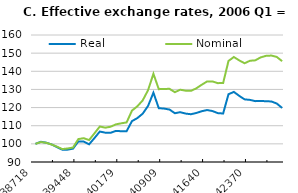
| Category | Real | Nominal |
|---|---|---|
| 38777.0 | 100 | 100 |
| 38869.0 | 101.134 | 101.006 |
| 38961.0 | 100.652 | 100.587 |
| 39052.0 | 99.677 | 99.624 |
| 39142.0 | 98.193 | 98.476 |
| 39234.0 | 96.787 | 97.125 |
| 39326.0 | 96.808 | 97.449 |
| 39417.0 | 97.36 | 97.973 |
| 39508.0 | 101.335 | 102.633 |
| 39600.0 | 101.259 | 103.119 |
| 39692.0 | 99.75 | 102.098 |
| 39783.0 | 103.182 | 105.798 |
| 39873.0 | 106.787 | 109.562 |
| 39965.0 | 106.172 | 108.926 |
| 40057.0 | 106.082 | 109.422 |
| 40148.0 | 107.148 | 110.754 |
| 40238.0 | 106.96 | 111.314 |
| 40330.0 | 107 | 111.818 |
| 40422.0 | 112.536 | 118.322 |
| 40513.0 | 114.191 | 120.704 |
| 40603.0 | 116.637 | 123.956 |
| 40695.0 | 120.908 | 129.595 |
| 40787.0 | 128.208 | 138.622 |
| 40878.0 | 119.672 | 130.146 |
| 40969.0 | 119.443 | 130.291 |
| 41061.0 | 118.901 | 130.313 |
| 41153.0 | 116.894 | 128.484 |
| 41244.0 | 117.461 | 129.848 |
| 41334.0 | 116.686 | 129.304 |
| 41426.0 | 116.33 | 129.223 |
| 41518.0 | 117.015 | 130.598 |
| 41609.0 | 117.972 | 132.56 |
| 41699.0 | 118.635 | 134.388 |
| 41791.0 | 118.098 | 134.405 |
| 41883.0 | 116.942 | 133.467 |
| 41974.0 | 116.73 | 133.508 |
| 42064.0 | 127.359 | 145.697 |
| 42156.0 | 128.638 | 147.872 |
| 42248.0 | 126.459 | 146.005 |
| 42339.0 | 124.523 | 144.422 |
| 42430.0 | 124.234 | 145.803 |
| 42522.0 | 123.547 | 146.038 |
| 42614.0 | 123.623 | 147.669 |
| 42705.0 | 123.511 | 148.514 |
| 42795.0 | 123.364 | 148.665 |
| 42887.0 | 122.229 | 147.92 |
| 42979.0 | 119.815 | 145.574 |